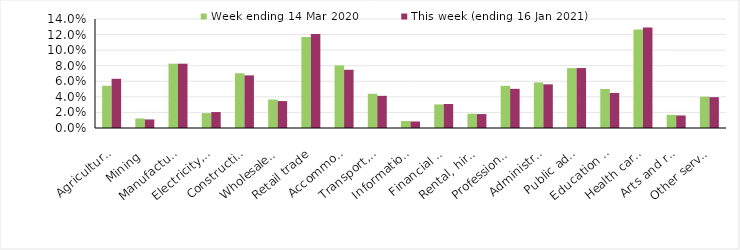
| Category | Week ending 14 Mar 2020 | This week (ending 16 Jan 2021) |
|---|---|---|
| Agriculture, forestry and fishing | 0.054 | 0.063 |
| Mining | 0.012 | 0.011 |
| Manufacturing | 0.083 | 0.083 |
| Electricity, gas, water and waste services | 0.019 | 0.02 |
| Construction | 0.07 | 0.068 |
| Wholesale trade | 0.037 | 0.035 |
| Retail trade | 0.117 | 0.121 |
| Accommodation and food services | 0.08 | 0.075 |
| Transport, postal and warehousing | 0.044 | 0.041 |
| Information media and telecommunications | 0.009 | 0.008 |
| Financial and insurance services | 0.03 | 0.031 |
| Rental, hiring and real estate services | 0.018 | 0.018 |
| Professional, scientific and technical services | 0.054 | 0.05 |
| Administrative and support services | 0.058 | 0.056 |
| Public administration and safety | 0.077 | 0.077 |
| Education and training | 0.05 | 0.045 |
| Health care and social assistance | 0.126 | 0.129 |
| Arts and recreation services | 0.017 | 0.016 |
| Other services | 0.04 | 0.04 |